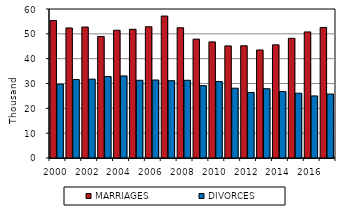
| Category | MARRIAGES | DIVORCES |
|---|---|---|
| 2000.0 | 55321 | 29704 |
| 2001.0 | 52374 | 31586 |
| 2002.0 | 52732 | 31758 |
| 2003.0 | 48943 | 32824 |
| 2004.0 | 51447 | 33060 |
| 2005.0 | 51829 | 31288 |
| 2006.0 | 52860 | 31415 |
| 2007.0 | 57157 | 31129 |
| 2008.0 | 52457 | 31300 |
| 2009.0 | 47862 | 29133 |
| 2010.0 | 46746 | 30783 |
| 2011.0 | 45137 | 28113 |
| 2012.0 | 45206 | 26402 |
| 2013.0 | 43499 | 27895 |
| 2014.0 | 45575 | 26764 |
| 2015.0 | 48191 | 26083 |
| 2016.0 | 50768 | 24996 |
| 2017.0 | 52567 | 25755 |